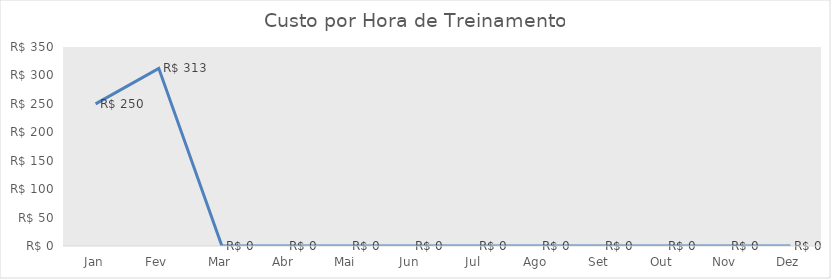
| Category | Custo por Hora de Treinamento |
|---|---|
| Jan | 250 |
| Fev | 312.5 |
| Mar | 0 |
| Abr | 0 |
| Mai | 0 |
| Jun | 0 |
| Jul | 0 |
| Ago | 0 |
| Set | 0 |
| Out | 0 |
| Nov | 0 |
| Dez | 0 |